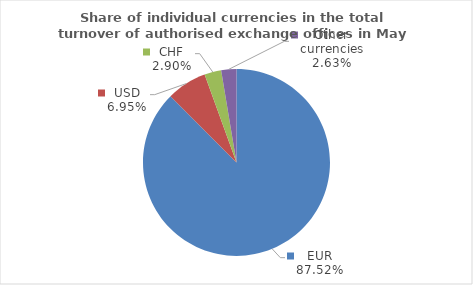
| Category | Series 0 |
|---|---|
| EUR | 87.518 |
| USD | 6.947 |
| CHF | 2.904 |
| Other currencies | 2.631 |